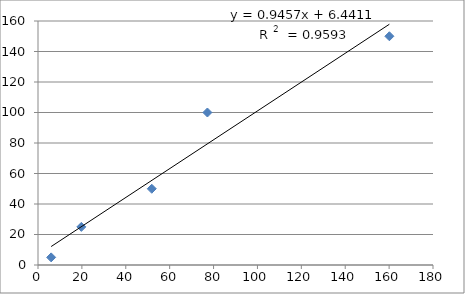
| Category | Series 0 |
|---|---|
| 5.994 | 5 |
| 19.753 | 25 |
| 51.838 | 50 |
| 77.202 | 100 |
| 160.12 | 150 |